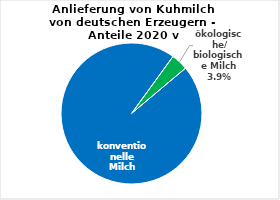
| Category | Anlieferung von Kuhmilch von deutschen Erzeugern - Anteile 2020 v |
|---|---|
| konventionelle Milch | 0.961 |
| ökologische/ biologische Milch | 0.039 |